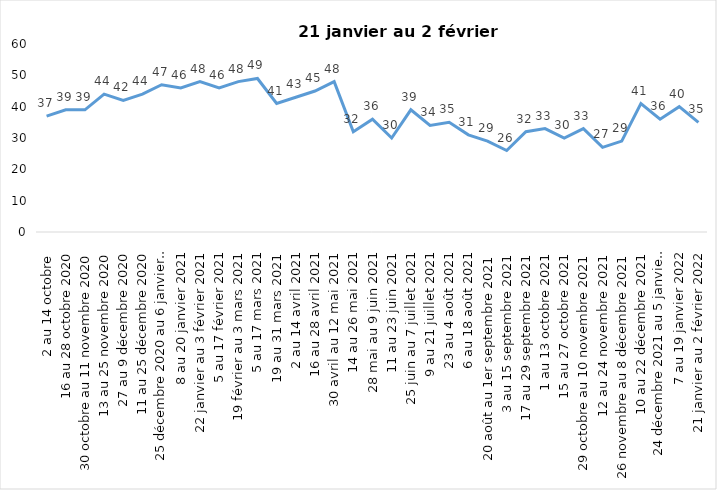
| Category | Toujours aux trois mesures |
|---|---|
| 2 au 14 octobre  | 37 |
| 16 au 28 octobre 2020 | 39 |
| 30 octobre au 11 novembre 2020 | 39 |
| 13 au 25 novembre 2020 | 44 |
| 27 au 9 décembre 2020 | 42 |
| 11 au 25 décembre 2020 | 44 |
| 25 décembre 2020 au 6 janvier  2021 | 47 |
| 8 au 20 janvier 2021 | 46 |
| 22 janvier au 3 février 2021 | 48 |
| 5 au 17 février 2021 | 46 |
| 19 février au 3 mars 2021 | 48 |
| 5 au 17 mars 2021 | 49 |
| 19 au 31 mars 2021 | 41 |
| 2 au 14 avril 2021 | 43 |
| 16 au 28 avril 2021 | 45 |
| 30 avril au 12 mai 2021 | 48 |
| 14 au 26 mai 2021 | 32 |
| 28 mai au 9 juin 2021 | 36 |
| 11 au 23 juin 2021 | 30 |
| 25 juin au 7 juillet 2021 | 39 |
| 9 au 21 juillet 2021 | 34 |
| 23 au 4 août 2021 | 35 |
| 6 au 18 août 2021 | 31 |
| 20 août au 1er septembre 2021 | 29 |
| 3 au 15 septembre 2021 | 26 |
| 17 au 29 septembre 2021 | 32 |
| 1 au 13 octobre 2021 | 33 |
| 15 au 27 octobre 2021 | 30 |
| 29 octobre au 10 novembre 2021 | 33 |
| 12 au 24 novembre 2021 | 27 |
| 26 novembre au 8 décembre 2021 | 29 |
| 10 au 22 décembre 2021 | 41 |
| 24 décembre 2021 au 5 janvier 2022 | 36 |
| 7 au 19 janvier 2022 | 40 |
| 21 janvier au 2 février 2022 | 35 |